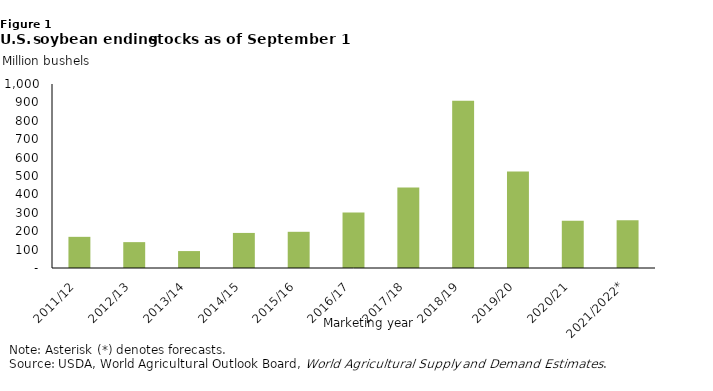
| Category | Series 2 |
|---|---|
|  2011/12  | 169.37 |
|  2012/13  | 140.557 |
|  2013/14  | 91.991 |
|  2014/15  | 190.61 |
|  2015/16  | 196.729 |
|  2016/17  | 301.595 |
|  2017/18  | 438.105 |
|  2018/19  | 909.052 |
|  2019/20  | 524.541 |
|  2020/21  | 256.979 |
|  2021/2022*  | 259.932 |